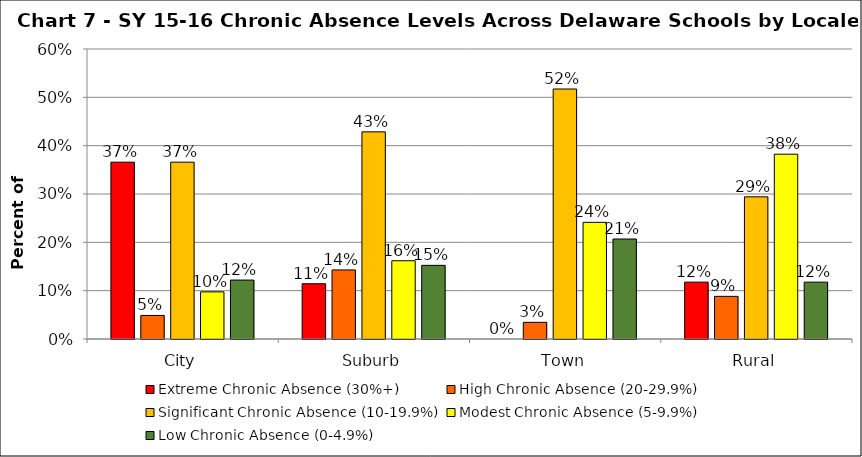
| Category | Extreme Chronic Absence (30%+) | High Chronic Absence (20-29.9%) | Significant Chronic Absence (10-19.9%) | Modest Chronic Absence (5-9.9%) | Low Chronic Absence (0-4.9%) |
|---|---|---|---|---|---|
| 0 | 0.366 | 0.049 | 0.366 | 0.098 | 0.122 |
| 1 | 0.114 | 0.143 | 0.429 | 0.162 | 0.152 |
| 2 | 0 | 0.034 | 0.517 | 0.241 | 0.207 |
| 3 | 0.118 | 0.088 | 0.294 | 0.382 | 0.118 |